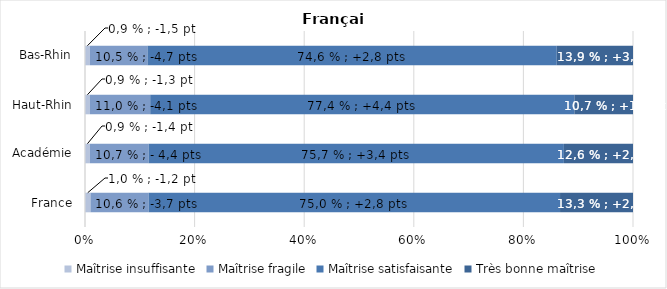
| Category | Maîtrise insuffisante | Maîtrise fragile | Maîtrise satisfaisante | Très bonne maîtrise |
|---|---|---|---|---|
| France | 1 | 10.6 | 75 | 13.3 |
| Académie | 0.9 | 10.7 | 75.7 | 12.6 |
| Haut-Rhin | 0.9 | 11 | 77.4 | 10.7 |
| Bas-Rhin | 0.9 | 10.5 | 74.6 | 13.9 |